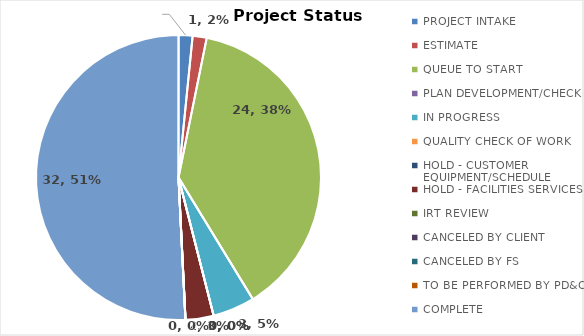
| Category | Series 19 |
|---|---|
| PROJECT INTAKE | 1 |
| ESTIMATE | 1 |
| QUEUE TO START | 24 |
| PLAN DEVELOPMENT/CHECK | 0 |
| IN PROGRESS | 3 |
| QUALITY CHECK OF WORK | 0 |
| HOLD - CUSTOMER EQUIPMENT/SCHEDULE | 0 |
| HOLD - FACILITIES SERVICES | 2 |
| IRT REVIEW | 0 |
| CANCELED BY CLIENT | 0 |
| CANCELED BY FS | 0 |
| TO BE PERFORMED BY PD&C | 0 |
| COMPLETE | 32 |